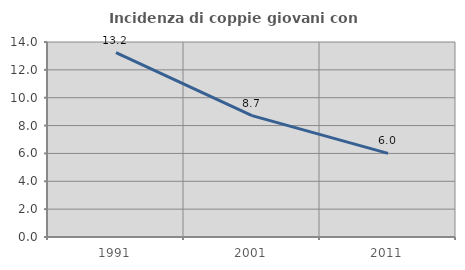
| Category | Incidenza di coppie giovani con figli |
|---|---|
| 1991.0 | 13.235 |
| 2001.0 | 8.715 |
| 2011.0 | 6.005 |